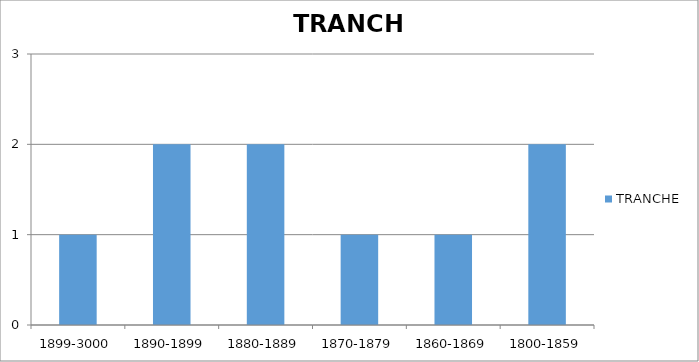
| Category | TRANCHE |
|---|---|
| 1899-3000 | 1 |
| 1890-1899 | 2 |
| 1880-1889 | 2 |
| 1870-1879 | 1 |
| 1860-1869 | 1 |
| 1800-1859 | 2 |